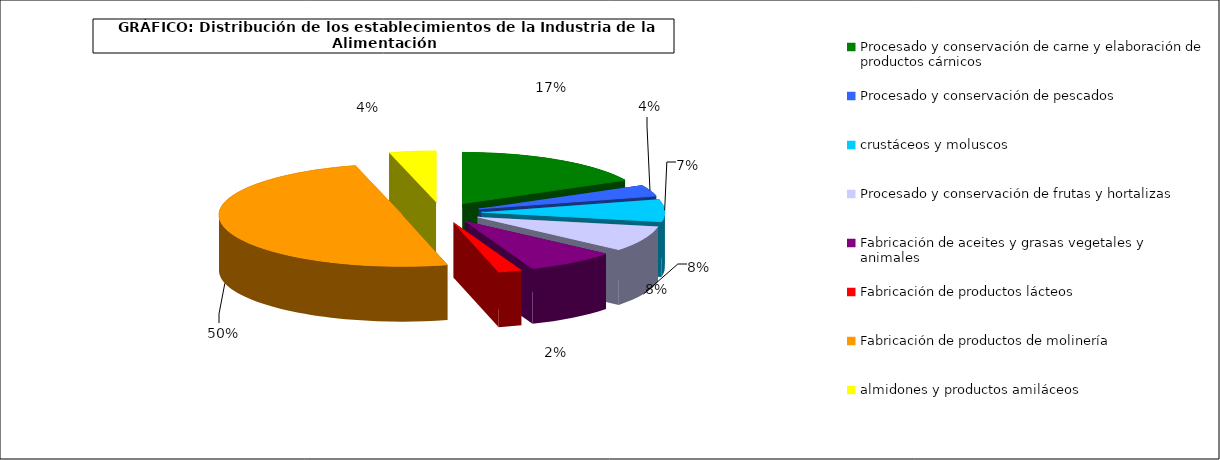
| Category | Procesado y conservación de carne y elaboración de productos cárnicos |
|---|---|
| 0 | 4347 |
| 1 | 881 |
| 2 | 1754 |
| 3 | 2011 |
| 4 | 1990 |
| 5 | 515 |
| 6 | 12443 |
| 7 | 1028 |